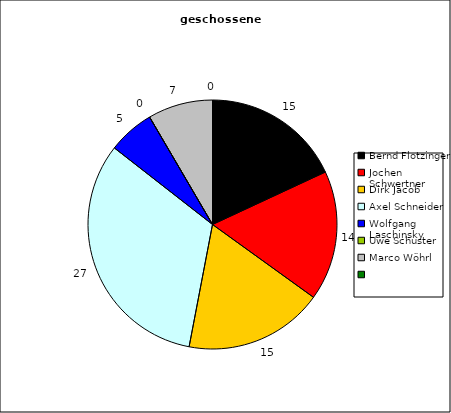
| Category | Ges. |
|---|---|
| Bernd Flotzinger | 15 |
| Jochen Schwertner | 14 |
| Dirk Jacob | 15 |
| Axel Schneider | 27 |
| Wolfgang Laschinsky | 5 |
| Uwe Schuster | 0 |
| Marco Wöhrl | 7 |